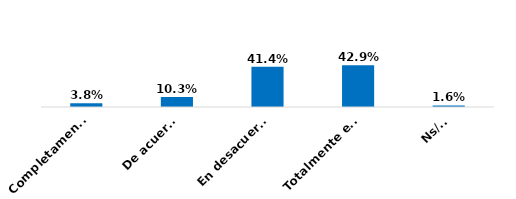
| Category | Series 0 |
|---|---|
| Completamente de acuerdo | 0.038 |
| De acuerdo | 0.103 |
| En desacuerdo | 0.414 |
| Totalmente en desacuerdo | 0.429 |
| Ns/Nr | 0.016 |